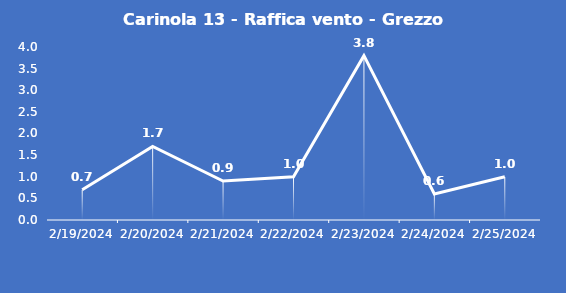
| Category | Carinola 13 - Raffica vento - Grezzo (m/s) |
|---|---|
| 2/19/24 | 0.7 |
| 2/20/24 | 1.7 |
| 2/21/24 | 0.9 |
| 2/22/24 | 1 |
| 2/23/24 | 3.8 |
| 2/24/24 | 0.6 |
| 2/25/24 | 1 |